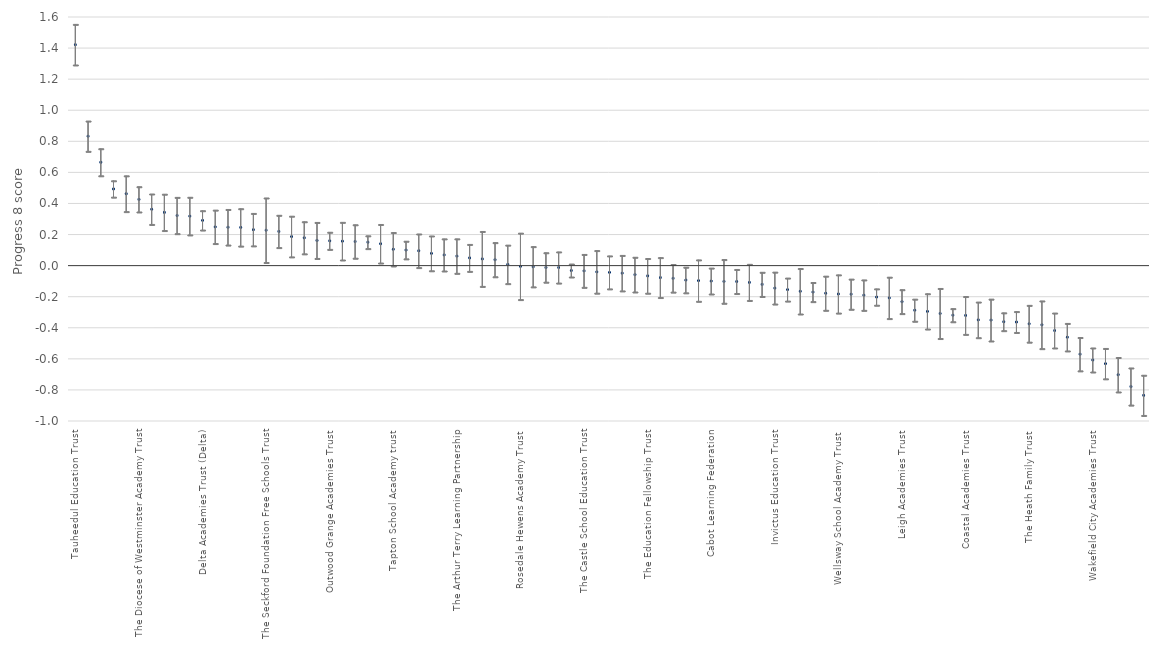
| Category | Series 0 | Series 1 | Series 2 |
|---|---|---|---|
| Tauheedul Education Trust | 1.422 | 1.552 | 1.291 |
| Dixons Academy Trust | 0.833 | 0.93 | 0.735 |
| Diocese of London | 0.665 | 0.752 | 0.578 |
| Harris Federation | 0.493 | 0.546 | 0.441 |
| The Cam Academy Trust | 0.463 | 0.578 | 0.347 |
| The Diocese of Westminster Academy Trust | 0.426 | 0.508 | 0.345 |
| The GORSE Academies Trust | 0.363 | 0.461 | 0.265 |
| East Midlands Education Trust | 0.343 | 0.459 | 0.226 |
| City of London Academies Trust | 0.322 | 0.439 | 0.206 |
| The Thinking Schools Academy Trust | 0.319 | 0.44 | 0.197 |
| Delta Academies Trust (Delta) | 0.291 | 0.353 | 0.229 |
| The Spencer Academies Trust | 0.249 | 0.357 | 0.142 |
| Tudor Grange Academies Trust | 0.247 | 0.361 | 0.132 |
| Russell Education Trust | 0.246 | 0.366 | 0.125 |
| Loxford School Trust Ltd | 0.231 | 0.336 | 0.127 |
| The Seckford Foundation Free Schools Trust | 0.228 | 0.435 | 0.02 |
| Kent Catholic Schools Partnership (KCSP) | 0.22 | 0.324 | 0.116 |
| Bright Futures Educational Trust | 0.187 | 0.318 | 0.056 |
| Guildford Education Partnership | 0.179 | 0.282 | 0.076 |
| The Rodillian Multi Academy Trust | 0.162 | 0.278 | 0.046 |
| Outwood Grange Academies Trust | 0.16 | 0.215 | 0.104 |
| FPTA Academies (Fort Pitt Grammar School and The Thomas Aveling School) | 0.157 | 0.278 | 0.036 |
| The Skinners' Company | 0.155 | 0.263 | 0.048 |
| United Learning | 0.15 | 0.192 | 0.109 |
| Aspirations Academies Trust (AAT) | 0.141 | 0.265 | 0.017 |
| Tapton School Academy trust | 0.105 | 0.213 | -0.002 |
| ARK Schools | 0.1 | 0.157 | 0.043 |
| Inspiration Trust | 0.095 | 0.204 | -0.013 |
| Carmel Education Trust | 0.079 | 0.191 | -0.033 |
| The Redhill Academy Trust | 0.069 | 0.172 | -0.035 |
| The Arthur Terry Learning Partnership | 0.061 | 0.172 | -0.05 |
| Brooke Weston Trust | 0.05 | 0.136 | -0.037 |
| Great Schools Trust | 0.043 | 0.22 | -0.134 |
| Samuel Ward Academy Trust | 0.038 | 0.148 | -0.072 |
| Landau Forte Charitable Trust | 0.008 | 0.132 | -0.116 |
| Rosedale Hewens Academy Trust | -0.005 | 0.209 | -0.219 |
| Diocese of Oxford | -0.007 | 0.122 | -0.137 |
| Cambridge Meridian Academies Trust (CMAT) | -0.012 | 0.083 | -0.107 |
| The Howard Partnership Trust | -0.012 | 0.088 | -0.112 |
| Ormiston Trust | -0.032 | 0.01 | -0.073 |
| The Castle School Education Trust | -0.034 | 0.072 | -0.14 |
| Bourne Education Trust | -0.04 | 0.097 | -0.177 |
| Swale Academies Trust | -0.044 | 0.062 | -0.15 |
| The Athelstan Trust | -0.049 | 0.066 | -0.163 |
| Matrix Academy Trust | -0.058 | 0.054 | -0.17 |
| The Education Fellowship Trust | -0.066 | 0.046 | -0.178 |
| The Co-operative Group | -0.077 | 0.051 | -0.206 |
| The Haberdashers' Livery Company | -0.082 | 0.007 | -0.171 |
| Diverse Academies Trust | -0.093 | -0.01 | -0.175 |
| White Rose Trust | -0.097 | 0.037 | -0.23 |
| Cabot Learning Federation | -0.099 | -0.016 | -0.183 |
| Stoke-on-Trent College | -0.102 | 0.039 | -0.242 |
| Creative Education Trust | -0.102 | -0.025 | -0.18 |
| The Dean Trust | -0.108 | 0.008 | -0.224 |
| David Ross Education Trust (DRET) | -0.121 | -0.043 | -0.199 |
| Invictus Education Trust | -0.145 | -0.042 | -0.247 |
| Academy Transformation Trust (ATT) | -0.154 | -0.08 | -0.228 |
| Grace Foundation | -0.165 | -0.019 | -0.312 |
| E-ACT | -0.17 | -0.109 | -0.232 |
| Transforming Education in Norfolk (the TEN Group) | -0.178 | -0.068 | -0.288 |
| Wellsway School Academy Trust | -0.183 | -0.06 | -0.306 |
| The Priory Federation of Academies Trust | -0.184 | -0.087 | -0.281 |
| CfBT Education Trust | -0.19 | -0.092 | -0.288 |
| Oasis Community Learning | -0.202 | -0.15 | -0.255 |
| Northern Schools Trust | -0.208 | -0.075 | -0.341 |
| Leigh Academies Trust | -0.232 | -0.155 | -0.309 |
| Greenwood Academies Trust | -0.287 | -0.216 | -0.358 |
| Community Academies Trust (CAT) | -0.295 | -0.181 | -0.408 |
| Bright Tribe Trust | -0.308 | -0.147 | -0.469 |
| Academies Enterprise Trust (AET) | -0.319 | -0.277 | -0.361 |
| Coastal Academies Trust | -0.321 | -0.199 | -0.443 |
| David Meller | -0.349 | -0.235 | -0.464 |
| Perry Beeches The Academy Trust | -0.35 | -0.216 | -0.485 |
| Kemnal Academy Trust, The (TKAT) | -0.361 | -0.304 | -0.419 |
| Northern Education Trust | -0.363 | -0.296 | -0.43 |
| The Heath Family Trust | -0.374 | -0.256 | -0.493 |
| Brook Learning Trust | -0.381 | -0.227 | -0.534 |
| Eastern Multi-Academy Trust | -0.418 | -0.305 | -0.53 |
| Woodard Academies Trust | -0.461 | -0.372 | -0.549 |
| Education Central Multi Academy Trust | -0.57 | -0.463 | -0.677 |
| Wakefield City Academies Trust | -0.607 | -0.53 | -0.685 |
| Aldridge Education | -0.631 | -0.533 | -0.729 |
| The Midland Academies Trust | -0.702 | -0.591 | -0.813 |
| Fylde Coast Teaching School Ltd | -0.778 | -0.659 | -0.898 |
| UCAT | -0.835 | -0.706 | -0.964 |